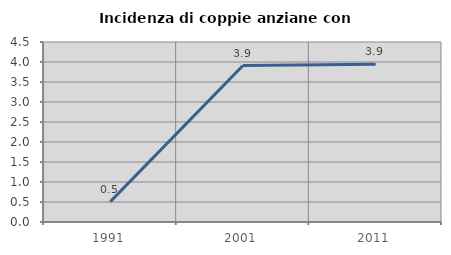
| Category | Incidenza di coppie anziane con figli |
|---|---|
| 1991.0 | 0.509 |
| 2001.0 | 3.911 |
| 2011.0 | 3.943 |